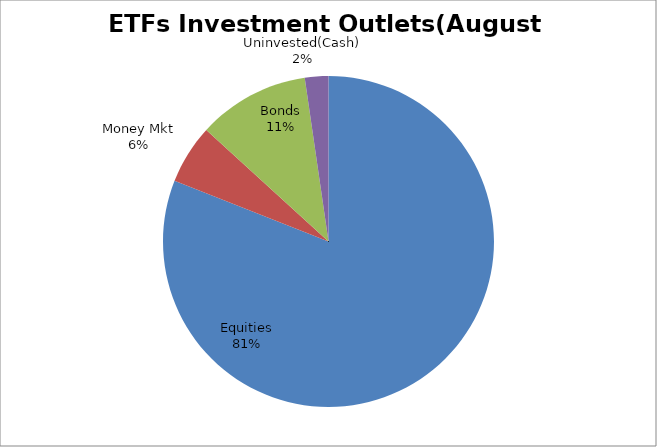
| Category | Series 0 |
|---|---|
| Equities | 3470989519.07 |
| Money Mkt | 248600081.58 |
| Bonds | 468259884.71 |
| Uninvested(Cash) | 98425220.25 |